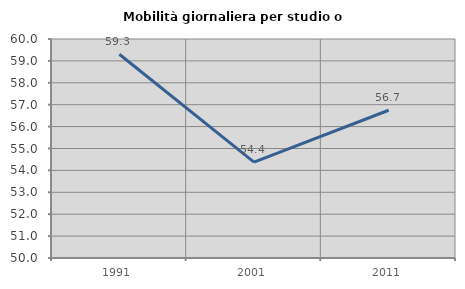
| Category | Mobilità giornaliera per studio o lavoro |
|---|---|
| 1991.0 | 59.305 |
| 2001.0 | 54.379 |
| 2011.0 | 56.747 |